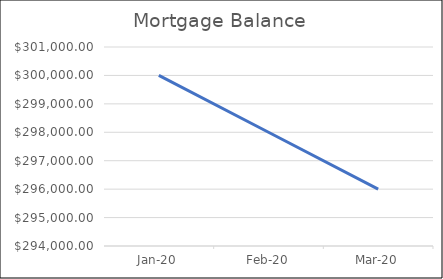
| Category | Series 0 |
|---|---|
| 2020-01-01 | 300000 |
| 2020-02-01 | 298000 |
| 2020-03-01 | 296000 |